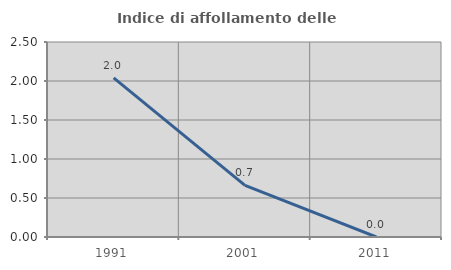
| Category | Indice di affollamento delle abitazioni  |
|---|---|
| 1991.0 | 2.041 |
| 2001.0 | 0.662 |
| 2011.0 | 0 |